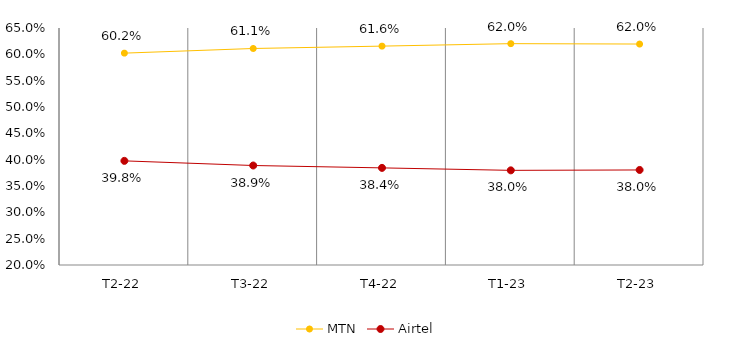
| Category | MTN | Airtel | Warid  |
|---|---|---|---|
| T2-22 | 0.602 | 0.398 |  |
| T3-22 | 0.611 | 0.389 |  |
| T4-22 | 0.616 | 0.384 |  |
| T1-23 | 0.62 | 0.38 |  |
| T2-23 | 0.62 | 0.38 |  |